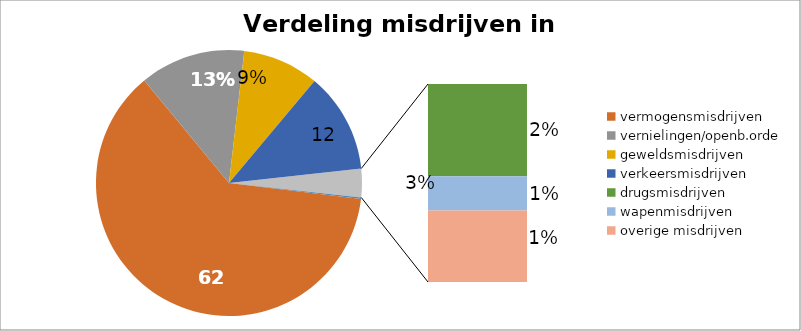
| Category | Series 0 |
|---|---|
| jaar | 2013 |
| vermogensmisdrijven | 676945 |
| vernielingen/openb.orde | 139900 |
| geweldsmisdrijven | 101155 |
| verkeersmisdrijven | 132560 |
| drugsmisdrijven | 17570 |
| wapenmisdrijven | 6545 |
| overige misdrijven | 13595 |